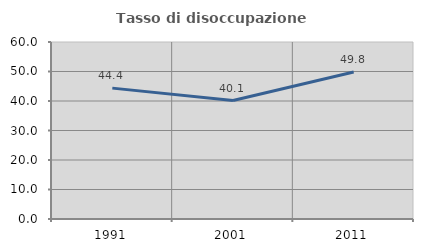
| Category | Tasso di disoccupazione giovanile  |
|---|---|
| 1991.0 | 44.364 |
| 2001.0 | 40.147 |
| 2011.0 | 49.838 |